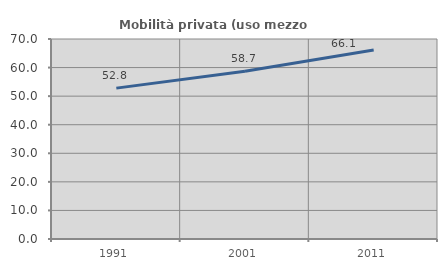
| Category | Mobilità privata (uso mezzo privato) |
|---|---|
| 1991.0 | 52.804 |
| 2001.0 | 58.676 |
| 2011.0 | 66.143 |